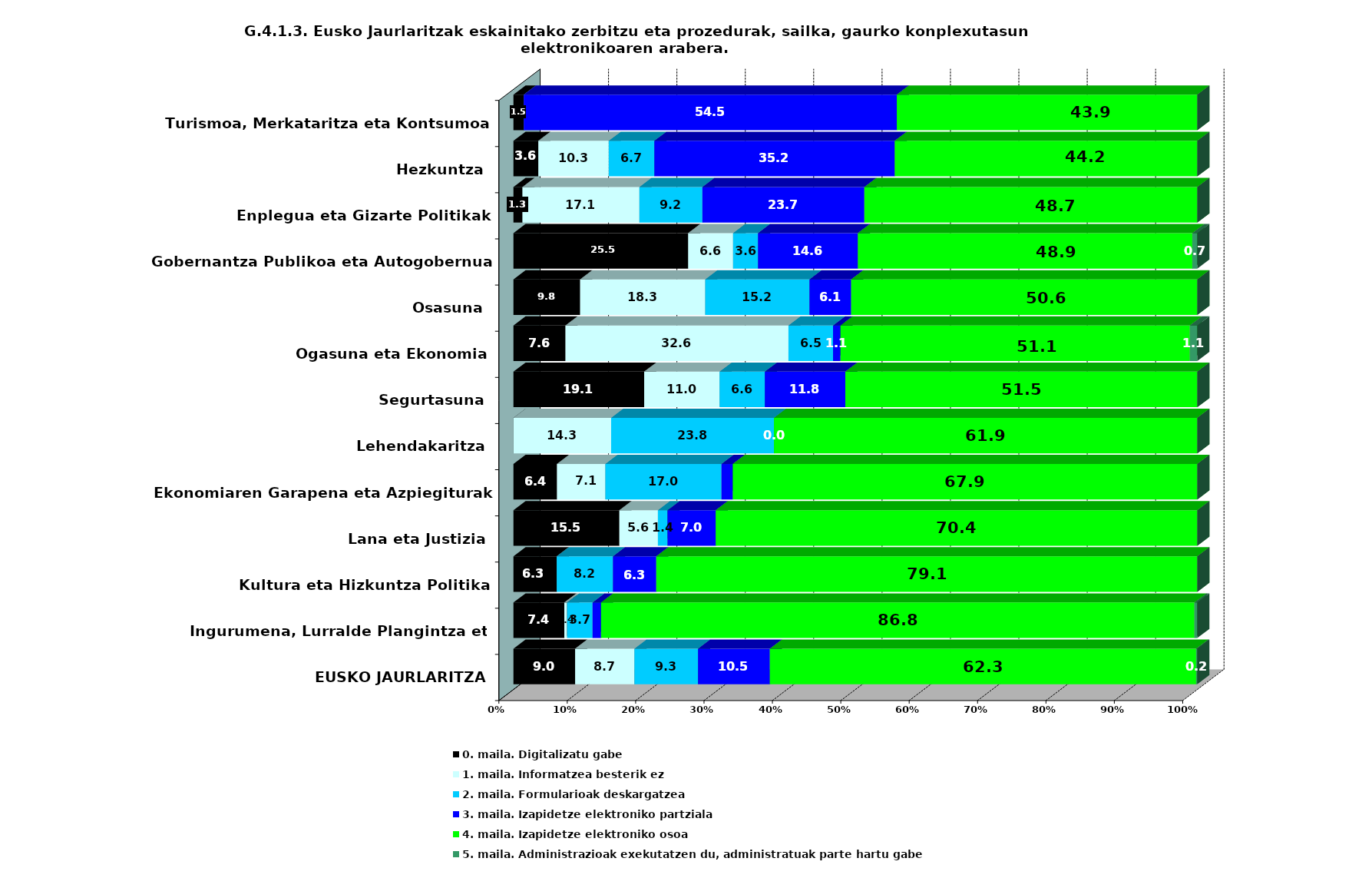
| Category | 0. maila. Digitalizatu gabe | 1. maila. Informatzea besterik ez | 2. maila. Formularioak deskargatzea | 3. maila. Izapidetze elektroniko partziala | 4. maila. Izapidetze elektroniko osoa | 5. maila. Administrazioak exekutatzen du, administratuak parte hartu gabe |
|---|---|---|---|---|---|---|
| EUSKO JAURLARITZA | 9.018 | 8.676 | 9.304 | 10.502 | 62.329 | 0.171 |
| Ingurumena, Lurralde Plangintza eta Etxebizitza | 7.438 | 0.413 | 3.719 | 1.24 | 86.777 | 0.413 |
| Kultura eta Hizkuntza Politika | 6.329 | 0 | 8.228 | 6.329 | 79.114 | 0 |
| Lana eta Justizia | 15.493 | 5.634 | 1.408 | 7.042 | 70.423 | 0 |
| Ekonomiaren Garapena eta Azpiegiturak | 6.368 | 7.075 | 16.981 | 1.651 | 67.925 | 0 |
| Lehendakaritza | 0 | 14.286 | 23.81 | 0 | 61.905 | 0 |
| Segurtasuna | 19.118 | 11.029 | 6.618 | 11.765 | 51.471 | 0 |
| Ogasuna eta Ekonomia | 7.609 | 32.609 | 6.522 | 1.087 | 51.087 | 1.087 |
| Osasuna | 9.756 | 18.293 | 15.244 | 6.098 | 50.61 | 0 |
| Gobernantza Publikoa eta Autogobernua | 25.547 | 6.569 | 3.65 | 14.599 | 48.905 | 0.73 |
| Enplegua eta Gizarte Politikak | 1.316 | 17.105 | 9.211 | 23.684 | 48.684 | 0 |
| Hezkuntza | 3.636 | 10.303 | 6.667 | 35.152 | 44.242 | 0 |
| Turismoa, Merkataritza eta Kontsumoa | 1.515 | 0 | 0 | 54.545 | 43.939 | 0 |